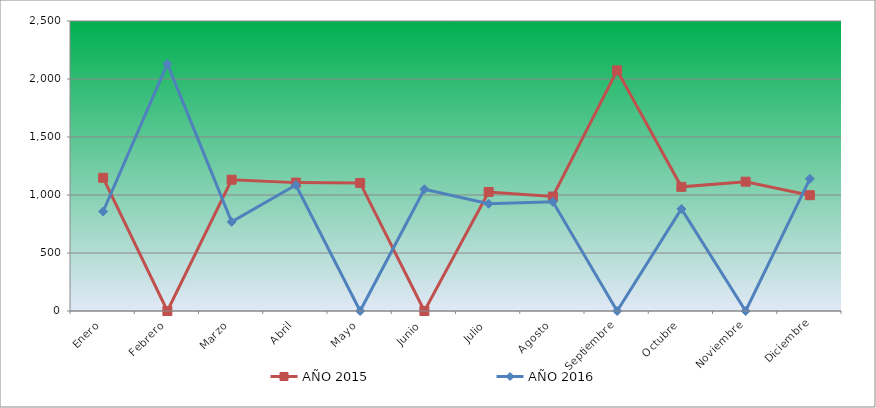
| Category | AÑO 2015 | AÑO 2016 |
|---|---|---|
| Enero | 1148.391 | 857.739 |
| Febrero | 0 | 2130.423 |
| Marzo | 1131.707 | 768.623 |
| Abril | 1106.681 | 1086.098 |
| Mayo | 1103.901 | 0 |
| Junio | 0 | 1049.895 |
| Julio | 1026.044 | 924.576 |
| Agosto | 987.115 | 941.285 |
| Septiembre | 2074.333 | 0 |
| Octubre | 1070.534 | 880.018 |
| Noviembre | 1115.023 | 0 |
| Diciembre | 998.238 | 1139.01 |